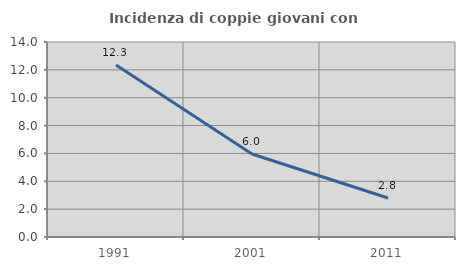
| Category | Incidenza di coppie giovani con figli |
|---|---|
| 1991.0 | 12.346 |
| 2001.0 | 5.96 |
| 2011.0 | 2.797 |